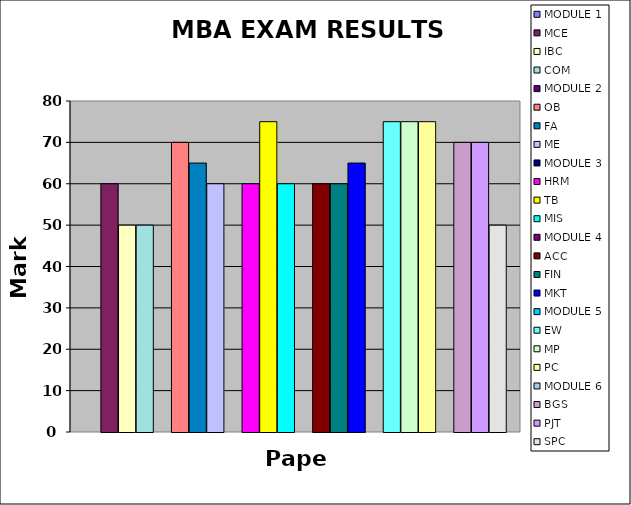
| Category | MODULE 1 | MCE | IBC | COM | MODULE 2 | OB | FA | ME | MODULE 3 | HRM | TB | MIS | MODULE 4 | ACC | FIN | MKT | MODULE 5 | EW | MP | PC | MODULE 6 | BGS | PJT | SPC |
|---|---|---|---|---|---|---|---|---|---|---|---|---|---|---|---|---|---|---|---|---|---|---|---|---|
| 0 |  | 60 | 50 | 50 |  | 70 | 65 | 60 |  | 60 | 75 | 60 |  | 60 | 60 | 65 |  | 75 | 75 | 75 |  | 70 | 70 | 50 |